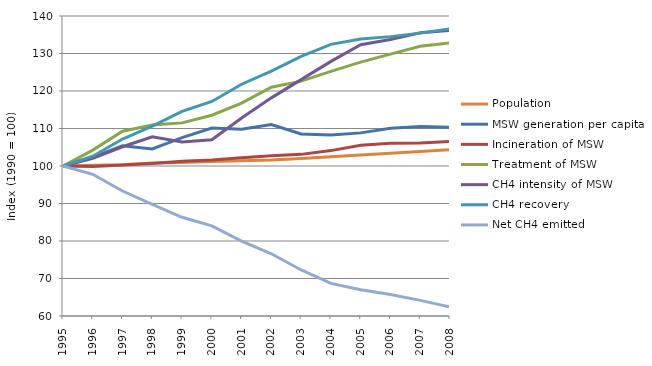
| Category | Population | MSW generation per capita | Incineration of MSW | Treatment of MSW | CH4 intensity of MSW | CH4 recovery | Net CH4 emitted |
|---|---|---|---|---|---|---|---|
| 1995.0 | 100 | 100 | 100 | 100 | 100 | 100 | 100 |
| 1996.0 | 100.177 | 102.376 | 99.852 | 104.238 | 102.074 | 102.604 | 97.782 |
| 1997.0 | 100.34 | 105.377 | 100.285 | 109.279 | 105.129 | 107.192 | 93.324 |
| 1998.0 | 100.82 | 104.542 | 100.695 | 110.956 | 107.768 | 110.653 | 89.739 |
| 1999.0 | 100.966 | 107.579 | 101.254 | 111.5 | 106.421 | 114.549 | 86.319 |
| 2000.0 | 101.207 | 110.136 | 101.571 | 113.531 | 106.991 | 117.21 | 84.033 |
| 2001.0 | 101.423 | 109.826 | 102.222 | 116.752 | 112.805 | 121.802 | 79.98 |
| 2002.0 | 101.599 | 111.071 | 102.711 | 120.988 | 118.171 | 125.286 | 76.588 |
| 2003.0 | 102.021 | 108.543 | 103.103 | 122.638 | 123.026 | 129.224 | 72.279 |
| 2004.0 | 102.472 | 108.235 | 104.104 | 125.247 | 127.89 | 132.446 | 68.689 |
| 2005.0 | 102.965 | 108.832 | 105.523 | 127.714 | 132.33 | 133.844 | 66.997 |
| 2006.0 | 103.4 | 110.088 | 106.07 | 129.831 | 133.731 | 134.498 | 65.719 |
| 2007.0 | 103.836 | 110.549 | 106.165 | 131.921 | 135.532 | 135.434 | 64.169 |
| 2008.0 | 104.326 | 110.354 | 106.554 | 132.835 | 136.188 | 136.593 | 62.397 |